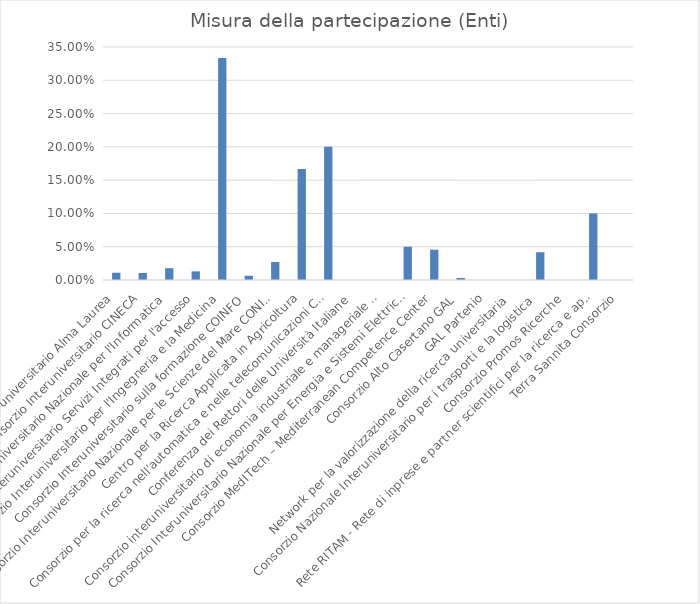
| Category | Misura della partecipazione |
|---|---|
| Consorzio Interuniversitario Alma Laurea | 0.011 |
| Consorzio Interuniversitario CINECA | 0.01 |
| Consorzio Interuniversitario Nazionale per l'Informatica | 0.018 |
| CISIA Consorzio Interuniversitario Servizi Integrati per l'accesso | 0.013 |
| Consorzio Interuniversitario per l'Ingegneria e la Medicina | 0.333 |
| Consorzio Interuniversitario sulla formazione COINFO | 0.006 |
| Consorzio Interuniversitario Nazionale per le Scienze del Mare CONISMA | 0.027 |
| Centro per la Ricerca Applicata in Agricoltura | 0.167 |
| Consorzio per la ricerca nell'automatica e nelle telecomunicazioni CRAT | 0.2 |
| Conferenza dei Rettori delle Università Italiane | 0 |
| Consorzio interuniversitario di economia industriale e manageriale CUEIM | 0 |
| Consorzio Interuniversitario Nazionale per Energia e Sistemi Elettrici -ENSIEL | 0.05 |
| Consorzio MedITech – Mediterranean Competence Center | 0.046 |
| Consorzio Alto Casertano GAL | 0.003 |
| GAL Partenio | 0 |
| Network per la valorizzazione della ricerca universitaria | 0 |
| Consorzio Nazionale Interuniversitario per i trasporti e la logistica | 0.042 |
| Consorzio Promos Ricerche | 0 |
| Rete RITAM - Rete di inprese e partner scientifici per la ricerca e applicazione di tecnologie avanzate | 0.1 |
| Terra Sannita Consorzio | 0 |